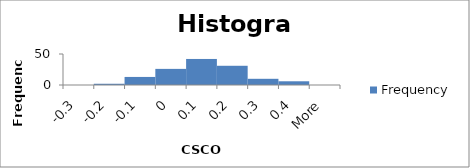
| Category | Frequency |
|---|---|
| -0.3 | 0 |
| -0.2 | 2 |
| -0.1 | 13 |
| 0 | 26 |
| 0.1 | 42 |
| 0.2 | 31 |
| 0.3 | 10 |
| 0.4 | 6 |
| More | 0 |